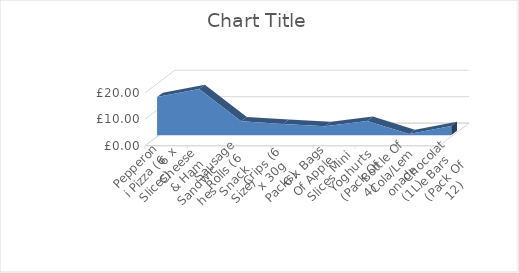
| Category | Series 0 |
|---|---|
| Pepperoni Pizza (6 Slices) | 14.95 |
| 6 x Cheese & Ham Sandwiches | 18 |
| Sausage Rolls (6 Snack Size) | 5.8 |
| Crips (6 x 30g Packs) | 4.8 |
| 6 x Bags Of Apple Slices  | 3.96 |
| Mini Yoghurts (Pack Of 4) | 5.94 |
| Bottle Of Cola/Lemonade (1L) | 0.99 |
| Chocolate Bars (Pack Of 12) | 3.98 |